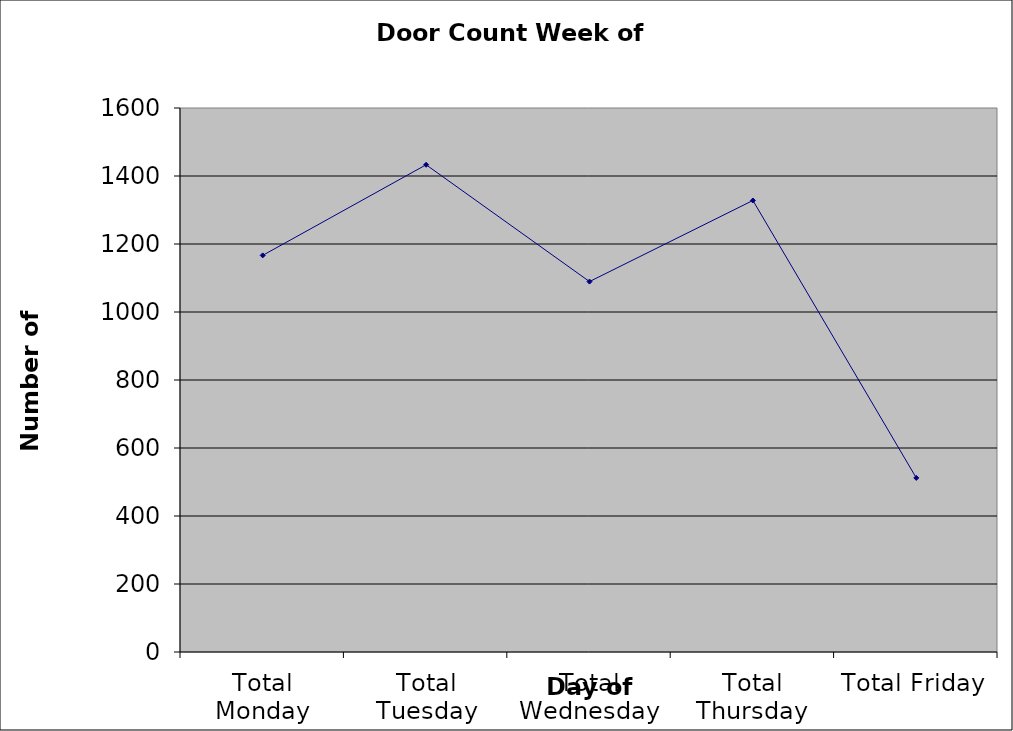
| Category | Series 0 |
|---|---|
| Total Monday | 1166.5 |
| Total Tuesday | 1433 |
| Total Wednesday | 1089.5 |
| Total Thursday | 1328 |
| Total Friday | 512 |